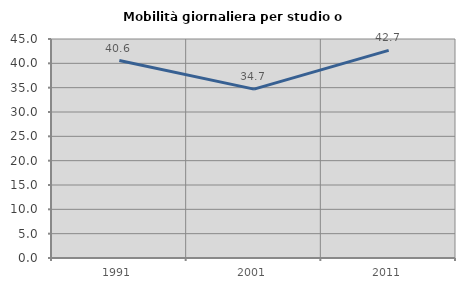
| Category | Mobilità giornaliera per studio o lavoro |
|---|---|
| 1991.0 | 40.581 |
| 2001.0 | 34.705 |
| 2011.0 | 42.652 |